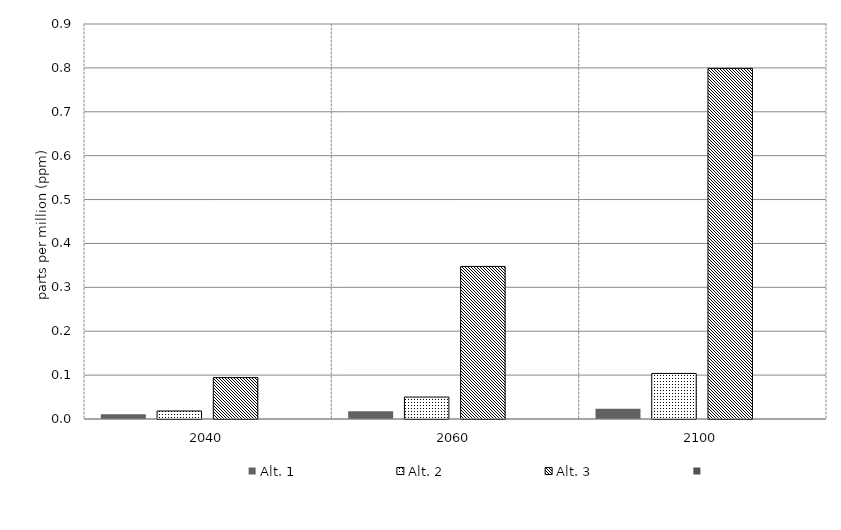
| Category | Alt. 1 | Alt. 2 | Alt. 3 | Series 3 | Alt 5 | Alt 6 | Alt 7 | Alt 8 | Alt 10 |
|---|---|---|---|---|---|---|---|---|---|
| 2040.0 | 0.011 | 0.018 | 0.094 |  |  |  |  |  |  |
| 2060.0 | 0.018 | 0.05 | 0.348 |  |  |  |  |  |  |
| 2100.0 | 0.024 | 0.104 | 0.799 |  |  |  |  |  |  |